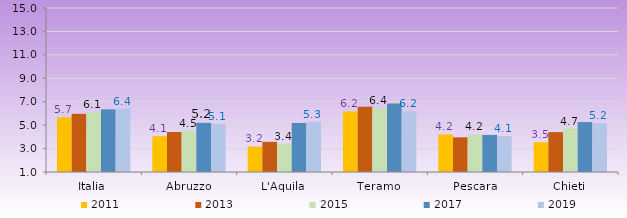
| Category | 2011 | 2013 | 2015 | 2017 | 2019 |
|---|---|---|---|---|---|
| Italia | 5.665 | 5.965 | 6.115 | 6.347 | 6.396 |
| Abruzzo | 4.059 | 4.416 | 4.514 | 5.196 | 5.124 |
| L'Aquila | 3.18 | 3.574 | 3.431 | 5.188 | 5.299 |
| Teramo | 6.173 | 6.576 | 6.449 | 6.849 | 6.194 |
| Pescara | 4.207 | 3.962 | 4.213 | 4.166 | 4.058 |
| Chieti | 3.541 | 4.408 | 4.713 | 5.261 | 5.165 |